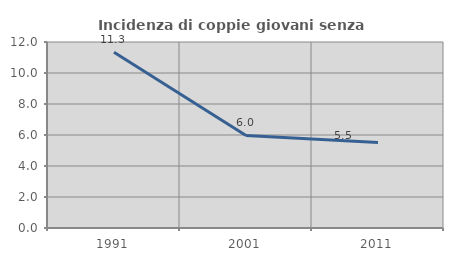
| Category | Incidenza di coppie giovani senza figli |
|---|---|
| 1991.0 | 11.34 |
| 2001.0 | 5.974 |
| 2011.0 | 5.523 |